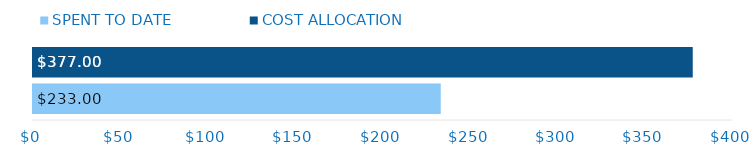
| Category | SPENT TO DATE | COST ALLOCATION |
|---|---|---|
| TOTALS | 233 | 377 |